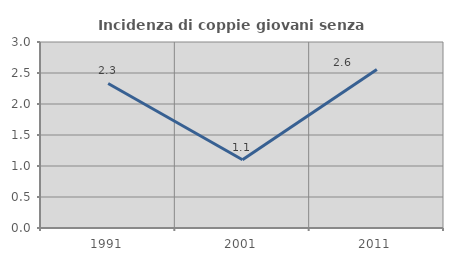
| Category | Incidenza di coppie giovani senza figli |
|---|---|
| 1991.0 | 2.331 |
| 2001.0 | 1.102 |
| 2011.0 | 2.556 |